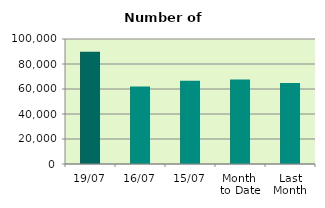
| Category | Series 0 |
|---|---|
| 19/07 | 89864 |
| 16/07 | 62008 |
| 15/07 | 66684 |
| Month 
to Date | 67537.692 |
| Last
Month | 64737.364 |